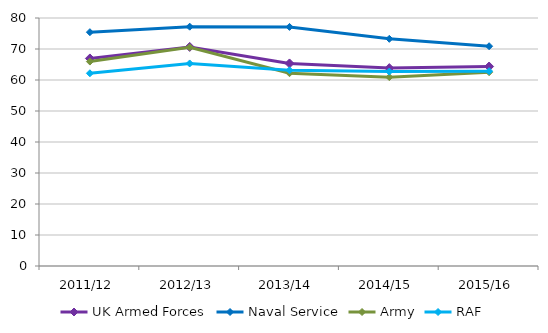
| Category | UK Armed Forces | Naval Service | Army | RAF |
|---|---|---|---|---|
| 2011/12 | 66.956 | 75.427 | 65.946 | 62.163 |
| 2012/13 | 70.664 | 77.196 | 70.549 | 65.335 |
| 2013/14 | 65.34 | 77.124 | 62.189 | 63.141 |
| 2014/15 | 63.833 | 73.289 | 60.923 | 62.704 |
| 2015/16 | 64.352 | 70.896 | 62.519 | 62.843 |